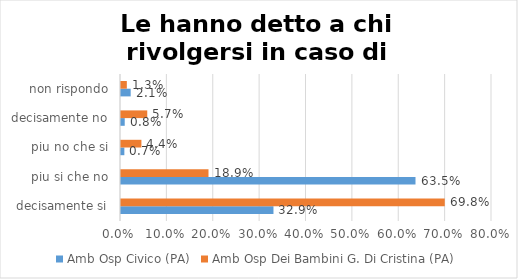
| Category | Amb Osp Civico (PA) | Amb Osp Dei Bambini G. Di Cristina (PA) |
|---|---|---|
| decisamente si | 0.329 | 0.698 |
| piu si che no | 0.635 | 0.189 |
| piu no che si | 0.007 | 0.044 |
| decisamente no | 0.008 | 0.057 |
| non rispondo | 0.021 | 0.013 |